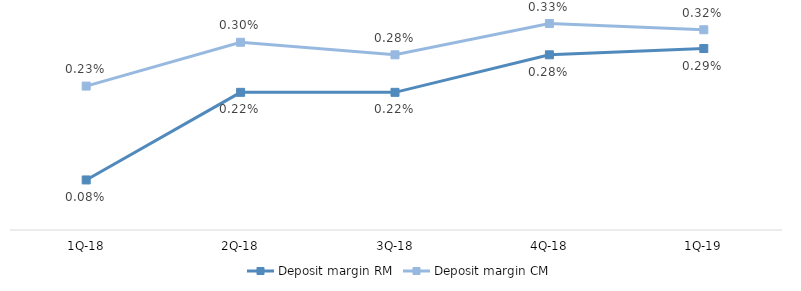
| Category | Deposit margin RM | Deposit margin CM |
|---|---|---|
| 1Q-19 | 0.003 | 0.003 |
| 4Q-18 | 0.003 | 0.003 |
| 3Q-18 | 0.002 | 0.003 |
| 2Q-18 | 0.002 | 0.003 |
| 1Q-18 | 0.001 | 0.002 |